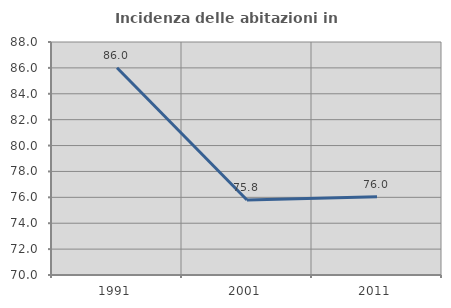
| Category | Incidenza delle abitazioni in proprietà  |
|---|---|
| 1991.0 | 86.016 |
| 2001.0 | 75.799 |
| 2011.0 | 76.038 |